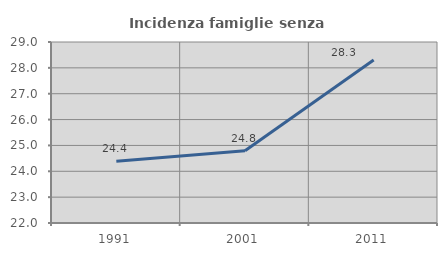
| Category | Incidenza famiglie senza nuclei |
|---|---|
| 1991.0 | 24.39 |
| 2001.0 | 24.796 |
| 2011.0 | 28.307 |